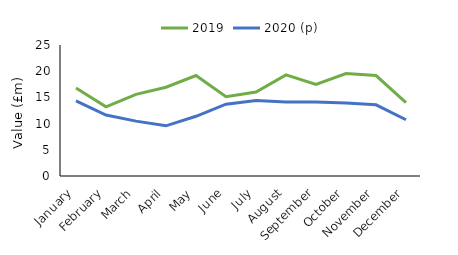
| Category | 2019 | 2020 (p) |
|---|---|---|
| January | 16.791 | 14.338 |
| February | 13.194 | 11.642 |
| March | 15.578 | 10.472 |
| April | 16.947 | 9.577 |
| May | 19.167 | 11.393 |
| June | 15.137 | 13.711 |
| July | 16.015 | 14.4 |
| August | 19.288 | 14.129 |
| September | 17.48 | 14.126 |
| October | 19.558 | 13.915 |
| November | 19.164 | 13.588 |
| December | 14.007 | 10.741 |